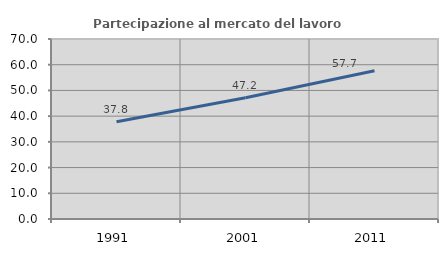
| Category | Partecipazione al mercato del lavoro  femminile |
|---|---|
| 1991.0 | 37.816 |
| 2001.0 | 47.181 |
| 2011.0 | 57.659 |